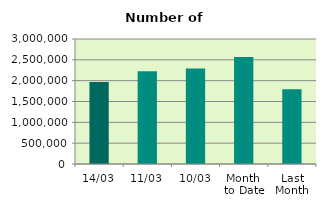
| Category | Series 0 |
|---|---|
| 14/03 | 1966250 |
| 11/03 | 2228210 |
| 10/03 | 2291604 |
| Month 
to Date | 2565344 |
| Last
Month | 1795830.8 |